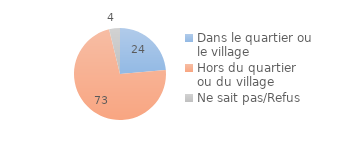
| Category | Series 0 |
|---|---|
| Dans le quartier ou le village | 23.572 |
| Hors du quartier ou du village | 72.613 |
| Ne sait pas/Refus | 3.815 |